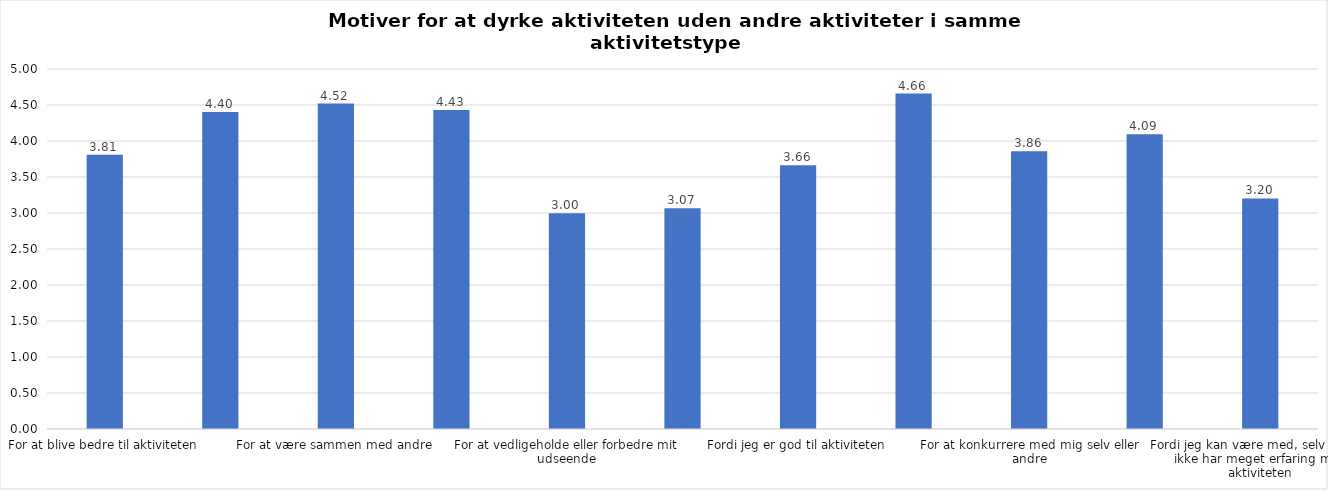
| Category | Gennemsnit |
|---|---|
| For at blive bedre til aktiviteten | 3.807 |
| For at vedligeholde eller forbedre min sundhed (fx helbred, fysisk form) | 4.402 |
| For at være sammen med andre | 4.519 |
| For at gøre noget godt for mig selv | 4.431 |
| For at vedligeholde eller forbedre mit udseende | 2.997 |
| Fordi andre i min omgangskreds opmuntrer mig til det | 3.065 |
| Fordi jeg er god til aktiviteten | 3.662 |
| Fordi jeg godt kan lide aktiviteten | 4.66 |
| For at konkurrere med mig selv eller andre | 3.859 |
| Fordi aktiviteten passer godt ind i min hverdag | 4.093 |
| Fordi jeg kan være med, selv om jeg ikke har meget erfaring med aktiviteten | 3.202 |